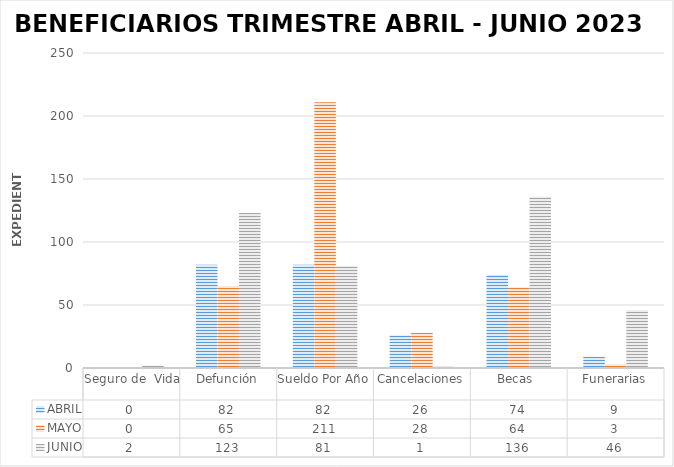
| Category | ABRIL | MAYO | JUNIO |
|---|---|---|---|
| Seguro de  Vida | 0 | 0 | 2 |
| Defunción | 82 | 65 | 123 |
| Sueldo Por Año | 82 | 211 | 81 |
| Cancelaciones | 26 | 28 | 1 |
| Becas  | 74 | 64 | 136 |
| Funerarias | 9 | 3 | 46 |